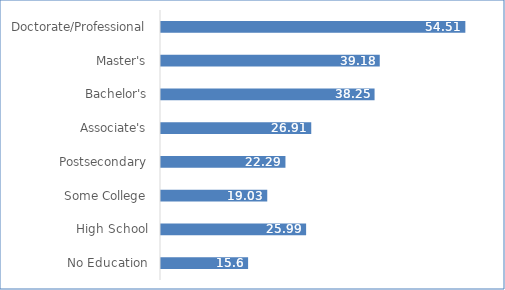
| Category | Series 0 |
|---|---|
| No Education | 15.6 |
| High School | 25.99 |
| Some College | 19.03 |
| Postsecondary | 22.29 |
| Associate's | 26.91 |
| Bachelor's | 38.25 |
| Master's | 39.18 |
| Doctorate/Professional | 54.51 |